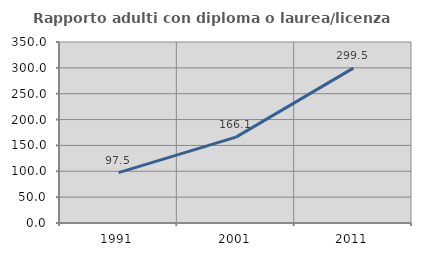
| Category | Rapporto adulti con diploma o laurea/licenza media  |
|---|---|
| 1991.0 | 97.53 |
| 2001.0 | 166.091 |
| 2011.0 | 299.527 |